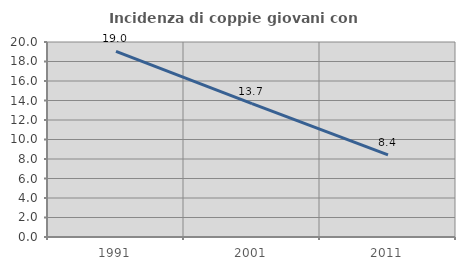
| Category | Incidenza di coppie giovani con figli |
|---|---|
| 1991.0 | 19.037 |
| 2001.0 | 13.684 |
| 2011.0 | 8.417 |